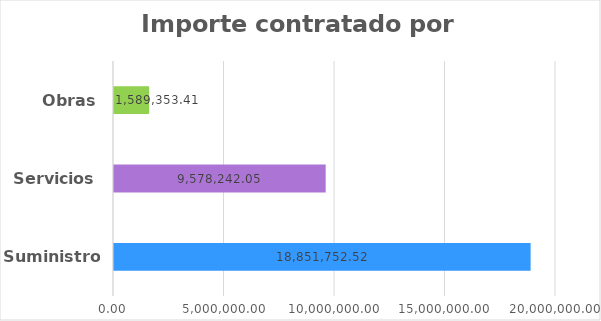
| Category | Series 0 |
|---|---|
| Suministros | 18851752.52 |
| Servicios | 9578242.05 |
| Obras | 1589353.41 |